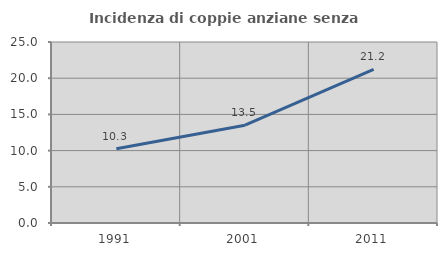
| Category | Incidenza di coppie anziane senza figli  |
|---|---|
| 1991.0 | 10.256 |
| 2001.0 | 13.514 |
| 2011.0 | 21.212 |